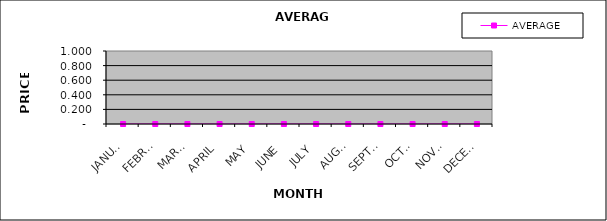
| Category | AVERAGE |
|---|---|
| JANUARY | 0 |
| FEBRUARY | 0 |
| MARCH | 0 |
| APRIL | 0 |
| MAY | 0 |
| JUNE | 0 |
| JULY | 0 |
| AUGUST | 0 |
| SEPTEMBER | 0 |
| OCTOBER | 0 |
| NOVEMBER | 0 |
| DECEMBER | 0 |